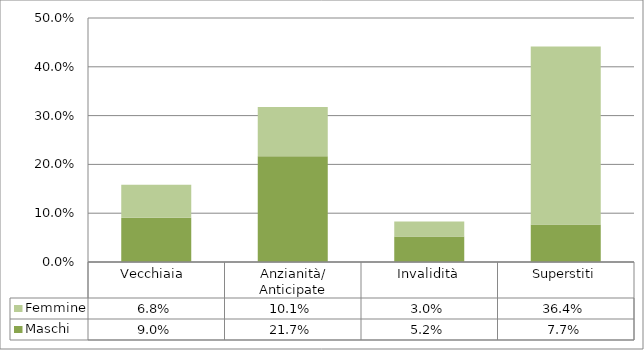
| Category | Maschi | Femmine |
|---|---|---|
| Vecchiaia  | 0.09 | 0.068 |
| Anzianità/ Anticipate | 0.217 | 0.101 |
| Invalidità | 0.052 | 0.03 |
| Superstiti | 0.077 | 0.364 |